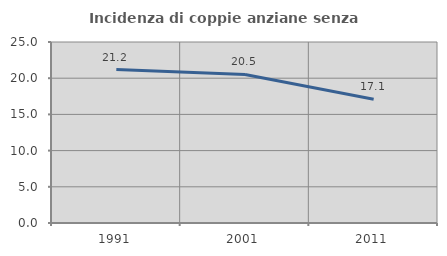
| Category | Incidenza di coppie anziane senza figli  |
|---|---|
| 1991.0 | 21.198 |
| 2001.0 | 20.513 |
| 2011.0 | 17.085 |